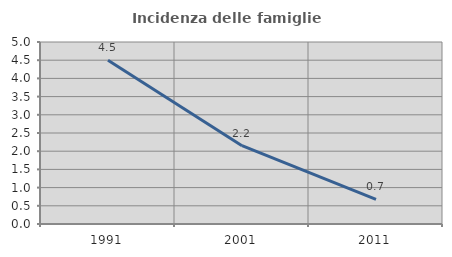
| Category | Incidenza delle famiglie numerose |
|---|---|
| 1991.0 | 4.496 |
| 2001.0 | 2.152 |
| 2011.0 | 0.677 |